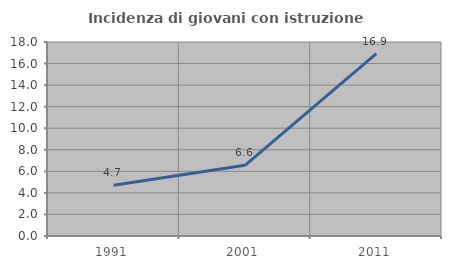
| Category | Incidenza di giovani con istruzione universitaria |
|---|---|
| 1991.0 | 4.711 |
| 2001.0 | 6.556 |
| 2011.0 | 16.912 |